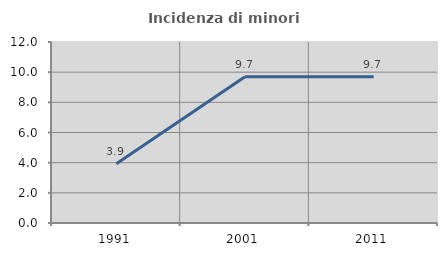
| Category | Incidenza di minori stranieri |
|---|---|
| 1991.0 | 3.922 |
| 2001.0 | 9.701 |
| 2011.0 | 9.69 |